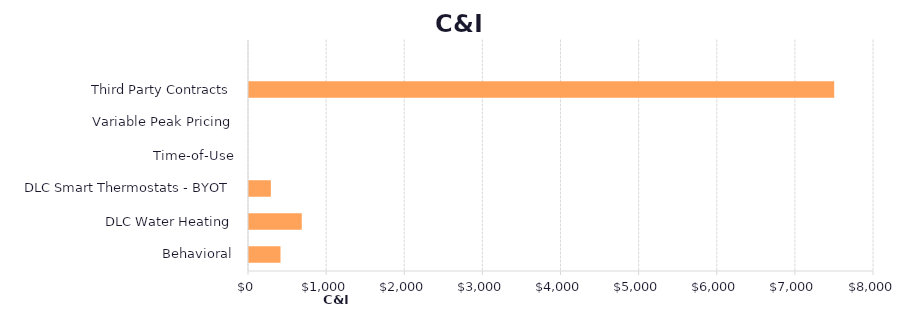
| Category | Series 1 |
|---|---|
| Behavioral | 403.088 |
| DLC Water Heating | 675.523 |
| DLC Smart Thermostats - BYOT | 279.955 |
| Time-of-Use | 0 |
| Variable Peak Pricing | 0 |
| Third Party Contracts | 7490.637 |